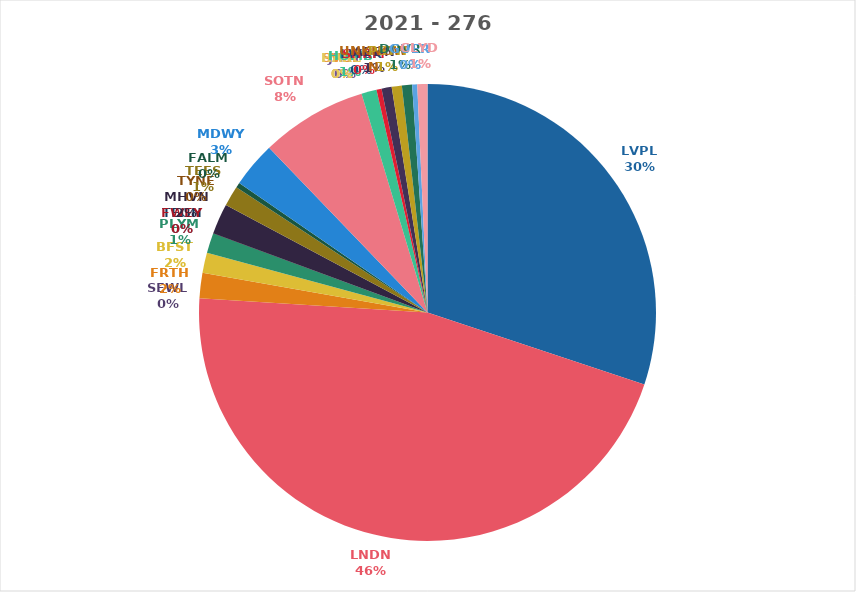
| Category | Series 0 |
|---|---|
| LVPL | 84 |
| LNDN | 128 |
| SEWL | 0 |
| FRTH | 5 |
| BFST | 4 |
| PLYM | 4 |
| TEGN | 0 |
| FWEY | 0 |
| MHVN | 6 |
| TYNE | 0 |
| TEES | 4 |
| FALM | 1 |
| MDWY | 9 |
| SOTN | 21 |
| JRSY | 0 |
| SVOE | 0 |
| HARC | 0 |
| HUMB | 3 |
| LWCK | 0 |
| SHRM | 1 |
| ABDN | 2 |
| UNKNOWN | 0 |
| PSTH | 2 |
| DOVR | 2 |
| GUER | 1 |
| CLYD | 2 |